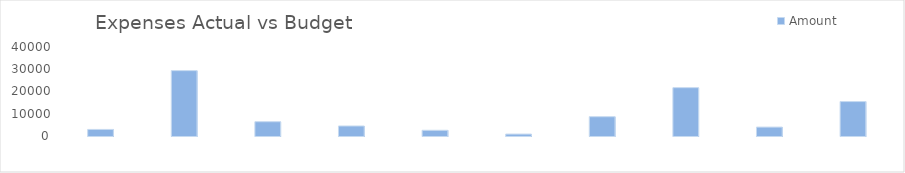
| Category | Amount |
|---|---|
| Administrative | 2948 |
| Payroll | 29376 |
| Marketing & Retention | 6417 |
| Repairs & Maintenance | 4495 |
| Grounds | 2566 |
| Other Operating | 867 |
| Utilities | 8667 |
| Real Property Taxes | 21722 |
| Casualty Multi Peril In | 4005 |
| Property Management Fee | 15466 |